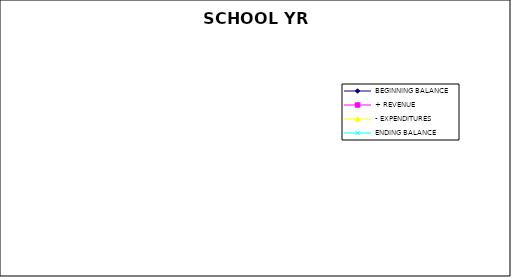
| Category | BEGINNING BALANCE | + REVENUE | - EXPENDITURES | ENDING BALANCE |
|---|---|---|---|---|
| 0 | 461023.52 | 4957.78 | 10829.62 | 455151.68 |
| 1 | 455151.68 | 504.67 | 23868.97 | 431787.38 |
| 2 | 431787.38 | 3092.18 | 26455.78 | 408423.78 |
| 3 | 408423.78 | 5372.21 | 8243.16 | 405552.83 |
| 4 | 405552.83 | 99410.48 | 9576.71 | 495386.6 |
| 5 | 495386.6 | 48922.3 | 103717.39 | 440591.51 |
| 6 | 440591.51 | 4819.37 | -7865.94 | 453276.82 |
| 7 | 453276.82 | 5596.55 | 34223.85 | 424649.52 |
| 8 | 424649.52 | 2606 | 4645.1 | 422610.42 |
| 9 | 422610.42 | 7201.24 | 5108.19 | 424703.47 |
| 10 | 424703.47 | 83172.03 | 1571.14 | 506304.36 |
| 11 | 506304.36 | 50670.17 | 25990.76 | 530983.77 |